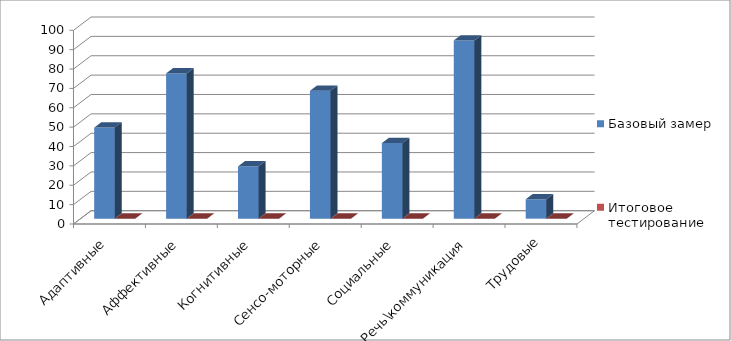
| Category | Базовый замер | Итоговое тестирование |
|---|---|---|
| Адаптивные | 47 | 0 |
| Аффективные | 75 | 0 |
| Когнитивные | 27 | 0 |
| Сенсо-моторные | 66 | 0 |
| Социальные | 39 | 0 |
| Речь\коммуникация | 92 | 0 |
| Трудовые | 10 | 0 |